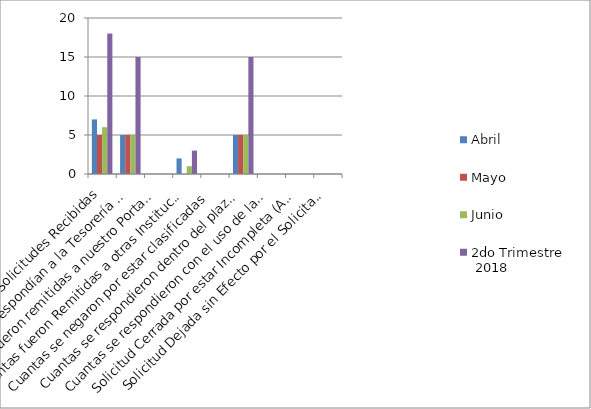
| Category | Abril | Mayo | Junio | 2do Trimestre
 2018 |
|---|---|---|---|---|
| Total de Solicitudes Recibidas | 7 | 5 | 6 | 18 |
| Cuantas le correspondían a la Tesorería Nacional | 5 | 5 | 5 | 15 |
| Cuantas fueron remitidas a nuestro Portal Web   | 0 | 0 | 0 | 0 |
| Cuantas fueron Remitidas a otras Instituciones | 2 | 0 | 1 | 3 |
| Cuantas se negaron por estar clasificadas | 0 | 0 | 0 | 0 |
| Cuantas se respondieron dentro del plazo de los 15 días laborables | 5 | 5 | 5 | 15 |
| Cuantas se respondieron con el uso de la prórroga de 10 días | 0 | 0 | 0 | 0 |
| Solicitud Cerrada por estar Incompleta (Art. 17,Reglamento 130-05) | 0 | 0 | 0 | 0 |
| Solicitud Dejada sin Efecto por el Solicitante (Declino Solicitante) | 0 | 0 | 0 | 0 |